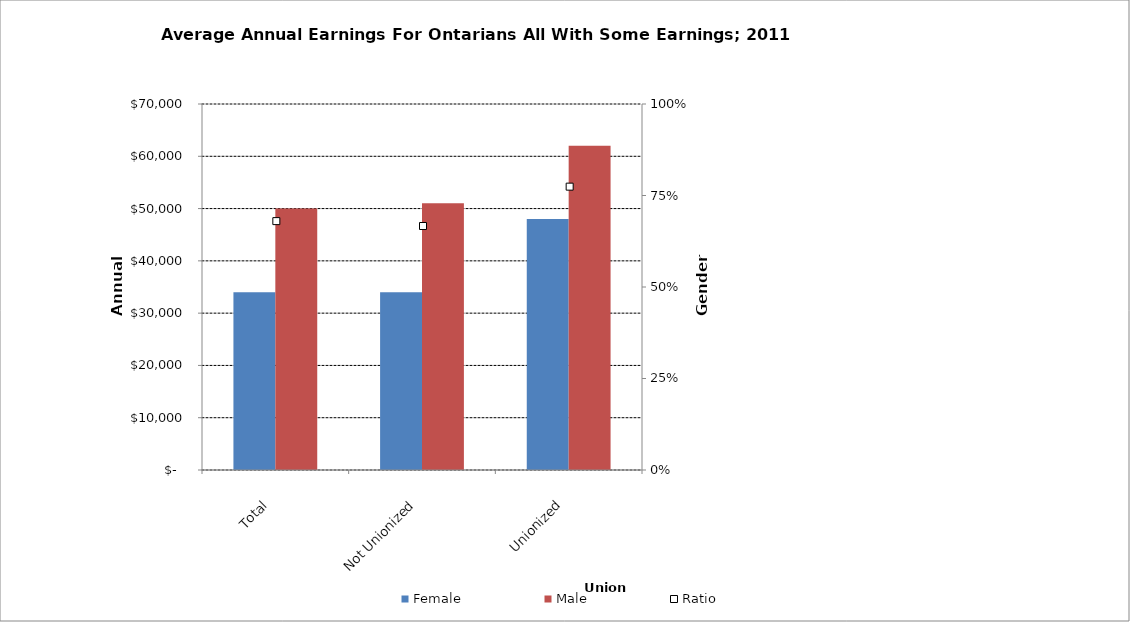
| Category | Female | Male |
|---|---|---|
| Total | 34000 | 50000 |
|  Not Unionized  | 34000 | 51000 |
|  Unionized  | 48000 | 62000 |